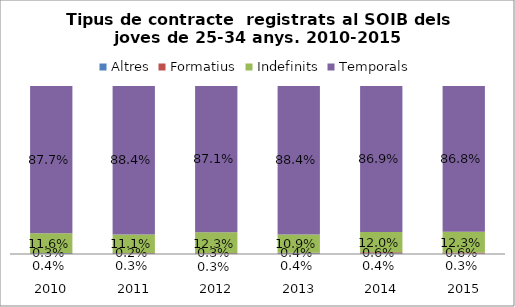
| Category | Altres | Formatius | Indefinits | Temporals |
|---|---|---|---|---|
| 
2010 | 0.004 | 0.003 | 0.116 | 0.877 |
| 
2011 | 0.003 | 0.002 | 0.111 | 0.884 |
| 
2012 | 0.003 | 0.003 | 0.123 | 0.871 |
| 
2013 | 0.004 | 0.004 | 0.109 | 0.884 |
| 
2014 | 0.004 | 0.006 | 0.12 | 0.869 |
| 
2015 | 0.003 | 0.006 | 0.123 | 0.868 |